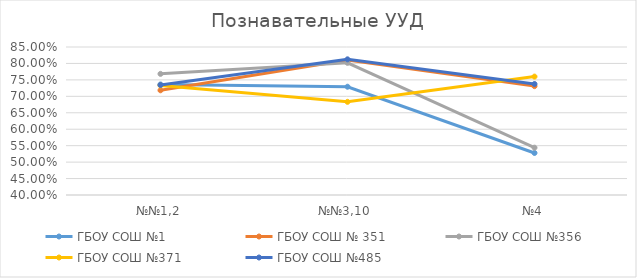
| Category | ГБОУ СОШ №1 | ГБОУ СОШ № 351 | ГБОУ СОШ №356 | ГБОУ СОШ №371 | ГБОУ СОШ №485 |
|---|---|---|---|---|---|
| №№1,2 | 0.736 | 0.718 | 0.768 | 0.733 | 0.734 |
| №№3,10 | 0.729 | 0.81 | 0.802 | 0.683 | 0.812 |
| №4 | 0.528 | 0.731 | 0.544 | 0.76 | 0.738 |